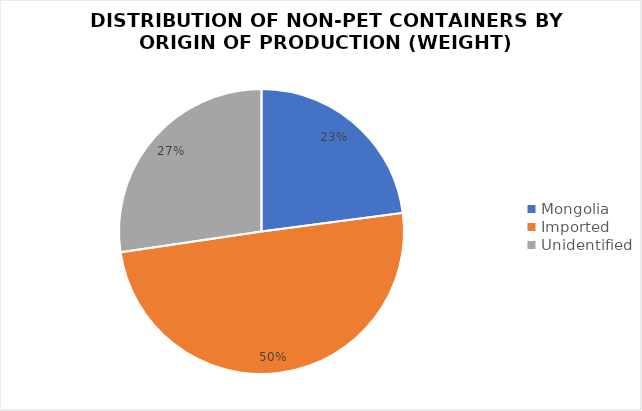
| Category | Series 0 |
|---|---|
| Mongolia | 12.36 |
| Imported | 26.84 |
| Unidentified | 14.74 |